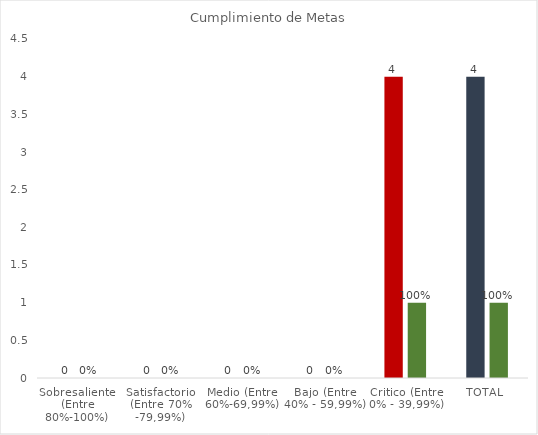
| Category | No. | % |
|---|---|---|
| Sobresaliente  (Entre 80%-100%)  | 0 | 0 |
| Satisfactorio (Entre 70% -79,99%) | 0 | 0 |
| Medio (Entre 60%-69,99%) | 0 | 0 |
| Bajo (Entre 40% - 59,99%) | 0 | 0 |
| Critico (Entre 0% - 39,99%) | 4 | 1 |
| TOTAL  | 4 | 1 |